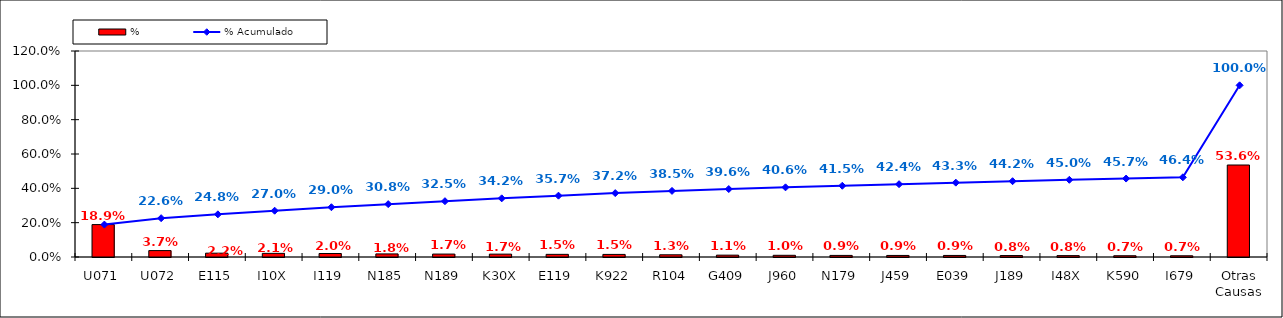
| Category | % |
|---|---|
| U071 | 0.189 |
| U072 | 0.037 |
| E115 | 0.022 |
| I10X | 0.021 |
| I119 | 0.02 |
| N185 | 0.018 |
| N189 | 0.017 |
| K30X | 0.017 |
| E119 | 0.015 |
| K922 | 0.015 |
| R104 | 0.013 |
| G409 | 0.011 |
| J960 | 0.01 |
| N179 | 0.009 |
| J459 | 0.009 |
| E039 | 0.009 |
| J189 | 0.008 |
| I48X | 0.008 |
| K590 | 0.007 |
| I679 | 0.007 |
| Otras Causas | 0.536 |